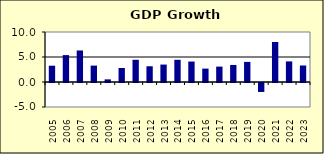
| Category | 2.5 |
|---|---|
| 2005.0 | 3.26 |
| 2006.0 | 5.38 |
| 2007.0 | 6.304 |
| 2008.0 | 3.281 |
| 2009.0 | 0.526 |
| 2010.0 | 2.806 |
| 2011.0 | 4.445 |
| 2012.0 | 3.147 |
| 2013.0 | 3.485 |
| 2014.0 | 4.444 |
| 2015.0 | 4.092 |
| 2016.0 | 2.678 |
| 2017.0 | 3.08 |
| 2018.0 | 3.407 |
| 2019.0 | 4.018 |
| 2020.0 | -1.792 |
| 2021.0 | 8.002 |
| 2022.0 | 4.118 |
| 2023.0 | 3.3 |